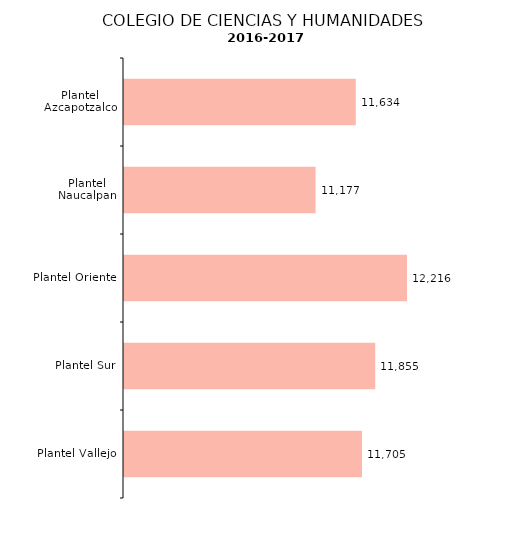
| Category | Series 0 |
|---|---|
| Plantel Vallejo | 11705 |
| Plantel Sur | 11855 |
| Plantel Oriente | 12216 |
| Plantel Naucalpan | 11177 |
| Plantel Azcapotzalco | 11634 |